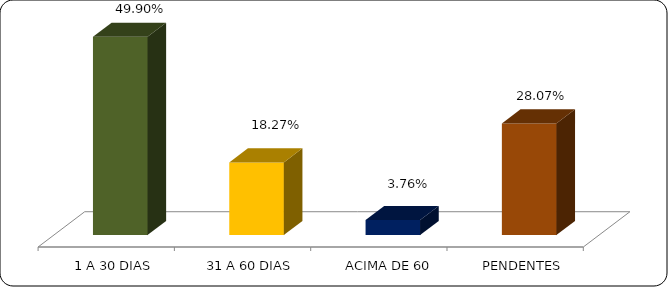
| Category | Series 0 |
|---|---|
|      1 A 30 DIAS | 0.499 |
|      31 A 60 DIAS | 0.183 |
|      ACIMA DE 60 DIAS | 0.038 |
|      PENDENTES | 0.281 |